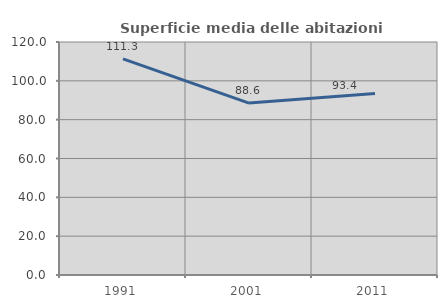
| Category | Superficie media delle abitazioni occupate |
|---|---|
| 1991.0 | 111.29 |
| 2001.0 | 88.553 |
| 2011.0 | 93.433 |